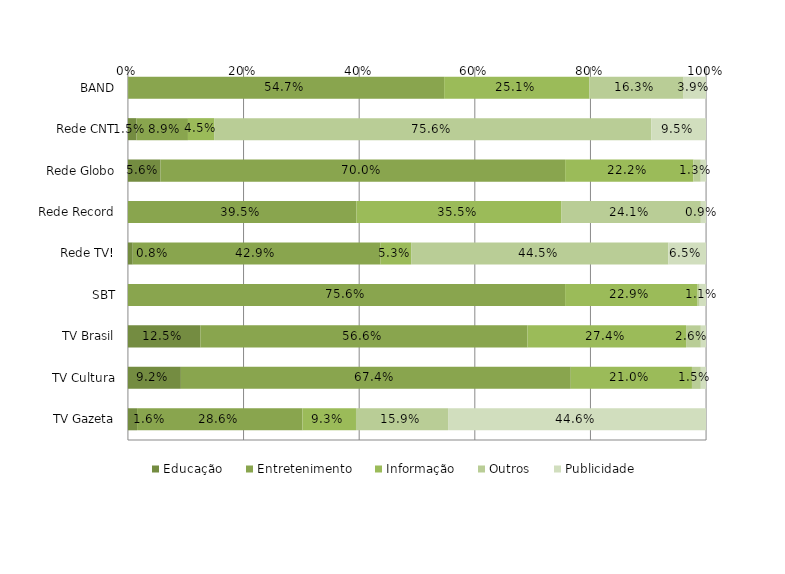
| Category | Educação | Entretenimento | Informação | Outros | Publicidade |
|---|---|---|---|---|---|
| BAND | 0 | 0.547 | 0.251 | 0.163 | 0.039 |
| Rede CNT | 0.015 | 0.089 | 0.045 | 0.756 | 0.095 |
| Rede Globo | 0.056 | 0.7 | 0.222 | 0.013 | 0.009 |
| Rede Record | 0 | 0.395 | 0.355 | 0.241 | 0.009 |
| Rede TV! | 0.008 | 0.429 | 0.053 | 0.445 | 0.065 |
| SBT | 0 | 0.756 | 0.229 | 0.004 | 0.011 |
| TV Brasil | 0.125 | 0.566 | 0.274 | 0.026 | 0.009 |
| TV Cultura | 0.092 | 0.674 | 0.21 | 0.015 | 0.009 |
| TV Gazeta | 0.016 | 0.286 | 0.093 | 0.159 | 0.446 |